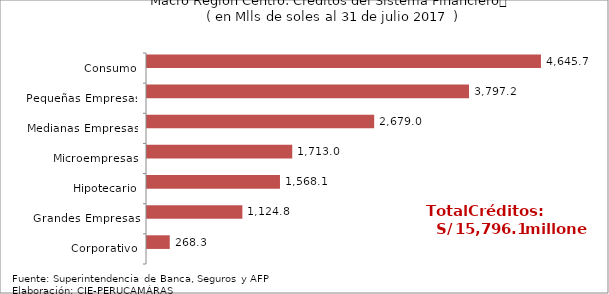
| Category | Series 0 | Series 1 |
|---|---|---|
| Corporativo |  | 268.263 |
| Grandes Empresas |  | 1124.792 |
| Hipotecario |  | 1568.136 |
| Microempresas |  | 1712.957 |
| Medianas Empresas |  | 2679.01 |
| Pequeñas Empresas |  | 3797.194 |
| Consumo |  | 4645.707 |